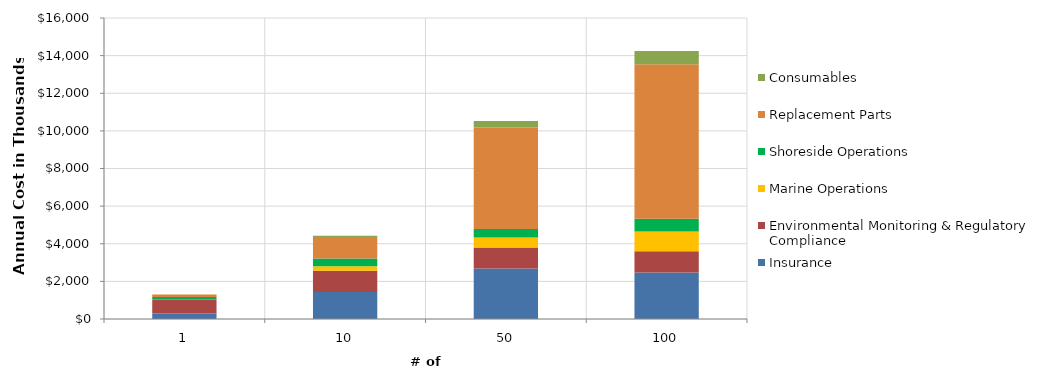
| Category | Insurance | Environmental Monitoring & Regulatory Compliance | Marine Operations | Shoreside Operations | Replacement Parts | Consumables |
|---|---|---|---|---|---|---|
| 1.0 | 294 | 710 | 25 | 142 | 126 | 7 |
| 10.0 | 1440 | 1121 | 249 | 400 | 1149 | 70 |
| 50.0 | 2682 | 1121 | 525 | 455 | 5391 | 350 |
| 100.0 | 2476 | 1121 | 1051 | 675 | 8219 | 700 |